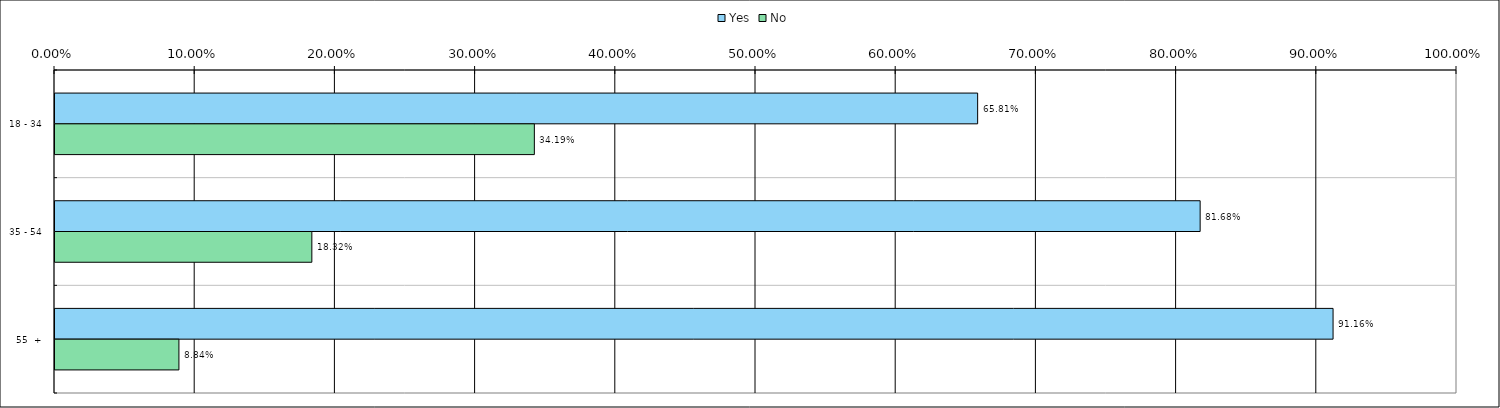
| Category | Yes | No |
|---|---|---|
| 0 | 0.658 | 0.342 |
| 1 | 0.817 | 0.183 |
| 2 | 0.912 | 0.088 |